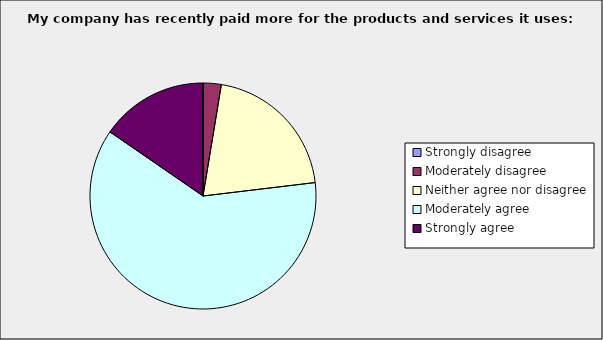
| Category | Series 0 |
|---|---|
| Strongly disagree | 0 |
| Moderately disagree | 0.026 |
| Neither agree nor disagree | 0.205 |
| Moderately agree | 0.615 |
| Strongly agree | 0.154 |